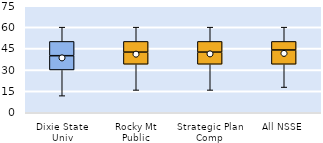
| Category | 25th | 50th | 75th |
|---|---|---|---|
| Dixie State Univ | 30 | 10 | 10 |
| Rocky Mt Public | 34 | 8.5 | 7.5 |
| Strategic Plan Comp | 34 | 8.5 | 7.5 |
| All NSSE | 34 | 10 | 6 |